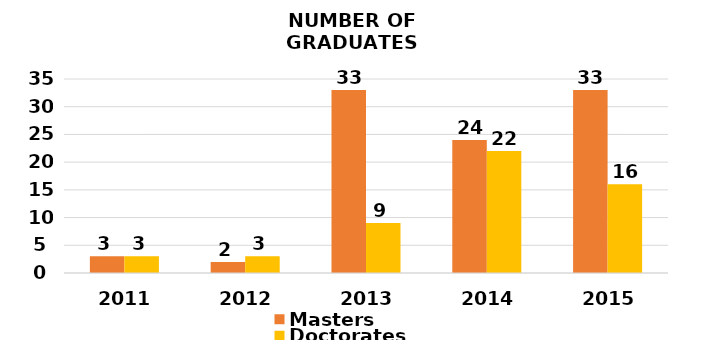
| Category | Masters | Doctorates |
|---|---|---|
| 2011.0 | 3 | 3 |
| 2012.0 | 2 | 3 |
| 2013.0 | 33 | 9 |
| 2014.0 | 24 | 22 |
| 2015.0 | 33 | 16 |